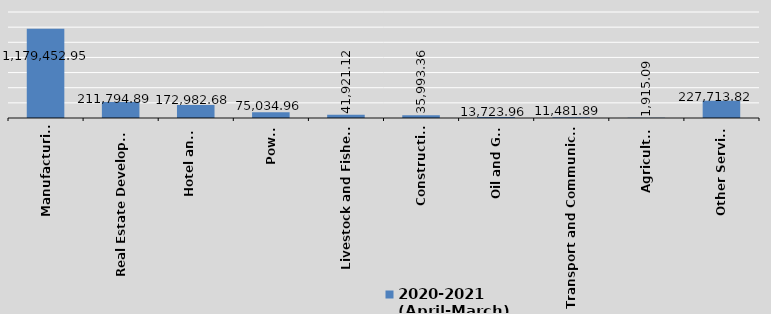
| Category | 2020-2021
(April-March) |
|---|---|
| Manufacturing | 1179452.95 |
| Real Estate Development | 211794.89 |
| Hotel and 
Tourism | 172982.68 |
| Power | 75034.96 |
| Livestock and Fisheries | 41921.12 |
| Construction | 35993.36 |
| Oil and Gas | 13723.96 |
| Transport and Communication | 11481.89 |
| Agriculture | 1915.09 |
| Other Services | 227713.82 |